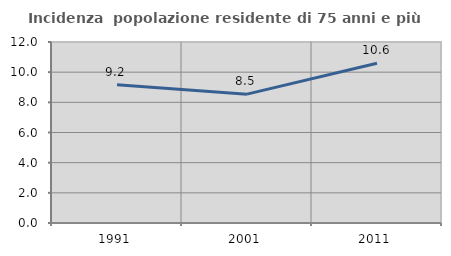
| Category | Incidenza  popolazione residente di 75 anni e più |
|---|---|
| 1991.0 | 9.159 |
| 2001.0 | 8.542 |
| 2011.0 | 10.59 |